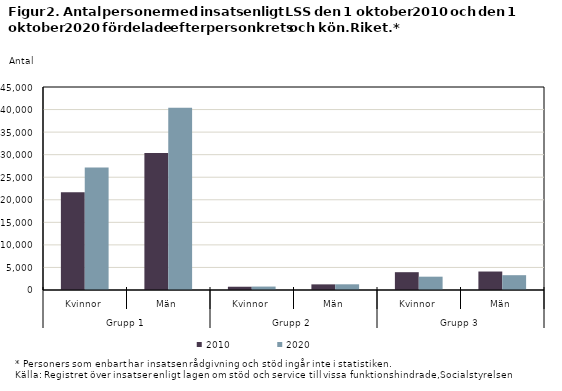
| Category | 2010 | 2020 |
|---|---|---|
| 0 | 21671 | 27176 |
| 1 | 30386 | 40375 |
| 2 | 725 | 762 |
| 3 | 1250 | 1264 |
| 4 | 3948 | 2953 |
| 5 | 4097 | 3283 |